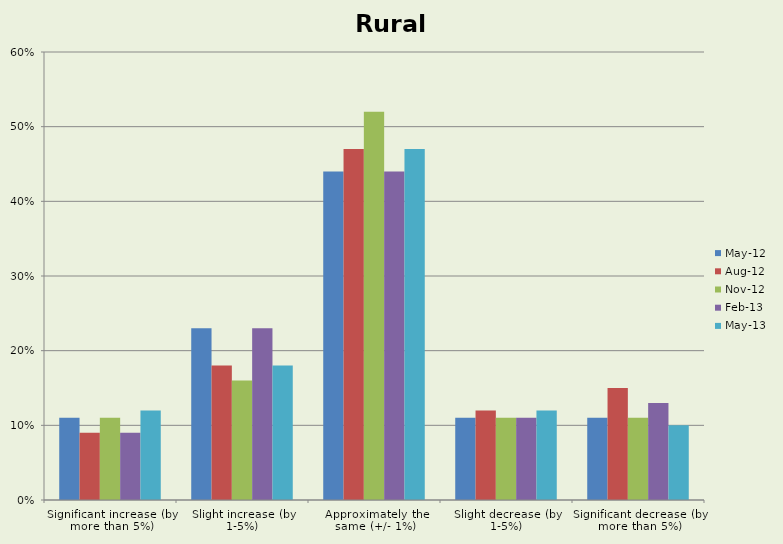
| Category | May-12 | Aug-12 | Nov-12 | Feb-13 | May-13 |
|---|---|---|---|---|---|
| Significant increase (by more than 5%) | 0.11 | 0.09 | 0.11 | 0.09 | 0.12 |
| Slight increase (by 1-5%) | 0.23 | 0.18 | 0.16 | 0.23 | 0.18 |
| Approximately the same (+/- 1%) | 0.44 | 0.47 | 0.52 | 0.44 | 0.47 |
| Slight decrease (by 1-5%) | 0.11 | 0.12 | 0.11 | 0.11 | 0.12 |
| Significant decrease (by more than 5%) | 0.11 | 0.15 | 0.11 | 0.13 | 0.1 |